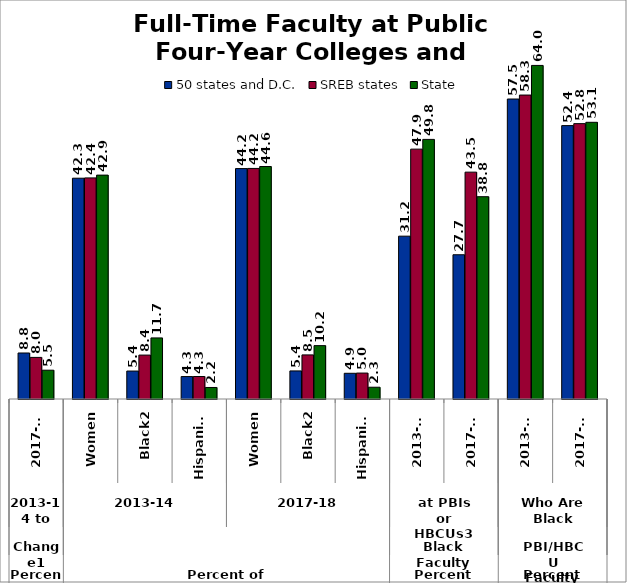
| Category | 50 states and D.C. | SREB states | State |
|---|---|---|---|
| 0 | 8.822 | 7.978 | 5.525 |
| 1 | 42.344 | 42.404 | 42.935 |
| 2 | 5.36 | 8.422 | 11.712 |
| 3 | 4.3 | 4.312 | 2.21 |
| 4 | 44.189 | 44.218 | 44.585 |
| 5 | 5.385 | 8.454 | 10.235 |
| 6 | 4.929 | 4.973 | 2.257 |
| 7 | 31.229 | 47.921 | 49.787 |
| 8 | 27.663 | 43.506 | 38.797 |
| 9 | 57.531 | 58.292 | 63.973 |
| 10 | 52.431 | 52.811 | 53.065 |